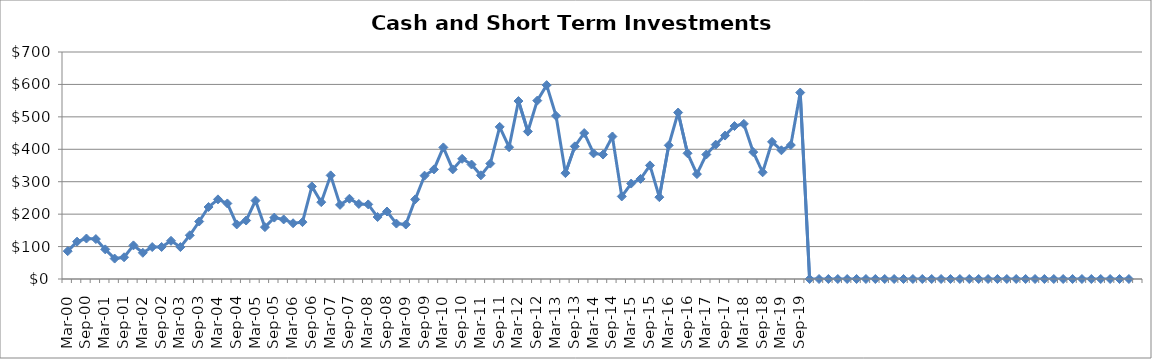
| Category | Cash and Short-Term Investments ($Millions) |
|---|---|
| Mar-00 | 85.806 |
| Jun-00 | 115.142 |
| Sep-00 | 124.84 |
| Dec-00 | 123.144 |
| Mar-01 | 91.308 |
| Jun-01 | 62.986 |
| Sep-01 | 67 |
| Dec-01 | 103.684 |
| Mar-02 | 80.835 |
| Jun-02 | 98.539 |
| Sep-02 | 98.75 |
| Dec-02 | 117.805 |
| Mar-03 | 98.446 |
| Jun-03 | 134.844 |
| Sep-03 | 177.269 |
| Dec-03 | 222.008 |
| Mar-04 | 245.558 |
| Jun-04 | 232.972 |
| Sep-04 | 168.22 |
| Dec-04 | 180.335 |
| Mar-05 | 241.872 |
| Jun-05 | 159.94 |
| Sep-05 | 189.321 |
| Dec-05 | 183.636 |
| Mar-06 | 171.91 |
| Jun-06 | 175.41 |
| Sep-06 | 285.561 |
| Dec-06 | 236.876 |
| Mar-07 | 319.584 |
| Jun-07 | 228.59 |
| Sep-07 | 247.438 |
| Dec-07 | 231.39 |
| Mar-08 | 230.057 |
| Jun-08 | 191.098 |
| Sep-08 | 208.137 |
| Dec-08 | 170.996 |
| Mar-09 | 167.988 |
| Jun-09 | 245.4 |
| Sep-09 | 318.709 |
| Dec-09 | 337.976 |
| Mar-10 | 405.784 |
| Jun-10 | 338 |
| Sep-10 | 370.564 |
| Dec-10 | 353.023 |
| Mar-11 | 319.726 |
| Jun-11 | 355.913 |
| Sep-11 | 469.093 |
| Dec-11 | 406.456 |
| Mar-12 | 548.779 |
| Jun-12 | 454.787 |
| Sep-12 | 550.073 |
| Dec-12 | 597.838 |
| Mar-13 | 503.14 |
| Jun-13 | 326.468 |
| Sep-13 | 409.036 |
| Dec-13 | 450.069 |
| Mar-14 | 387.405 |
| Jun-14 | 383.73 |
| Sep-14 | 439.339 |
| Dec-14 | 254.584 |
| Mar-15 | 294.275 |
| Jun-15 | 308.6 |
| Sep-15 | 350.35 |
| Dec-15 | 252.336 |
| Mar-16 | 412.137 |
| Jun-16 | 513.342 |
| Sep-16 | 387.722 |
| Dec-16 | 323.476 |
| Mar-17 | 383.942 |
| Jun-17 | 414.32 |
| Sep-17 | 442.358 |
| Dec-17 | 471.696 |
| Mar-18 | 478.366 |
| Jun-18 | 391.295 |
| Sep-18 | 329 |
| Dec-18 | 423 |
| Mar-19 | 396.882 |
| Jun-19 | 413 |
| Sep-19 | 575 |